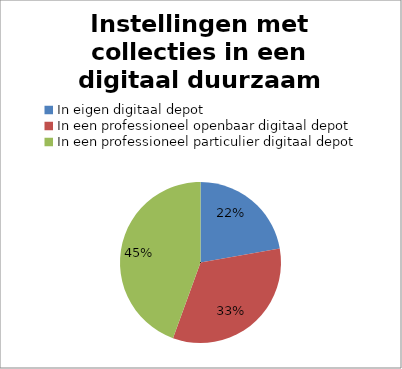
| Category | Series 0 |
|---|---|
| In eigen digitaal depot | 6 |
| In een professioneel openbaar digitaal depot | 9 |
| In een professioneel particulier digitaal depot | 12 |